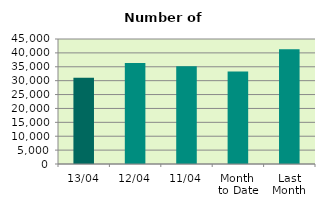
| Category | Series 0 |
|---|---|
| 13/04 | 31064 |
| 12/04 | 36322 |
| 11/04 | 35214 |
| Month 
to Date | 33274.571 |
| Last
Month | 41301.217 |